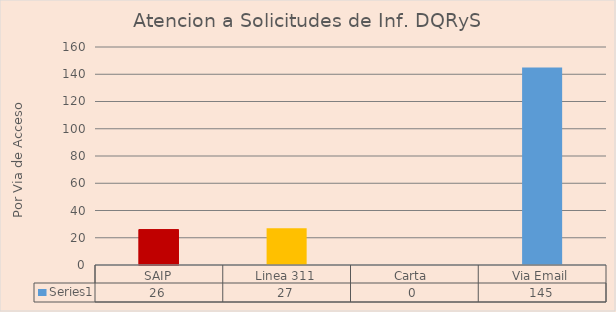
| Category | Series 0 |
|---|---|
| SAIP | 26 |
| Linea 311 | 27 |
| Carta  | 0 |
| Via Email | 145 |